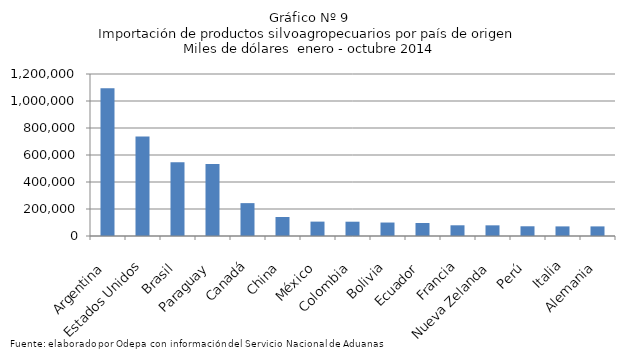
| Category | Series 0 |
|---|---|
| Argentina | 1095307.297 |
| Estados Unidos | 736632.442 |
| Brasil | 545555.213 |
| Paraguay | 533326.317 |
| Canadá | 243486.943 |
| China | 140655.304 |
| México | 106537.434 |
| Colombia | 105900.614 |
| Bolivia | 99775.944 |
| Ecuador | 96096.389 |
| Francia | 79308.342 |
| Nueva Zelanda | 79030.605 |
| Perú | 72009.23 |
| Italia | 71165.963 |
| Alemania | 71133.266 |